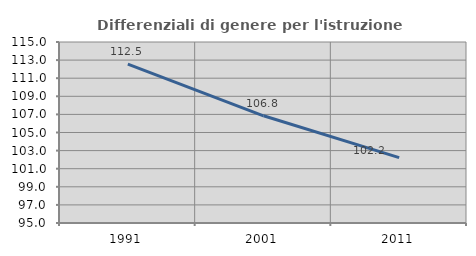
| Category | Differenziali di genere per l'istruzione superiore |
|---|---|
| 1991.0 | 112.55 |
| 2001.0 | 106.844 |
| 2011.0 | 102.229 |